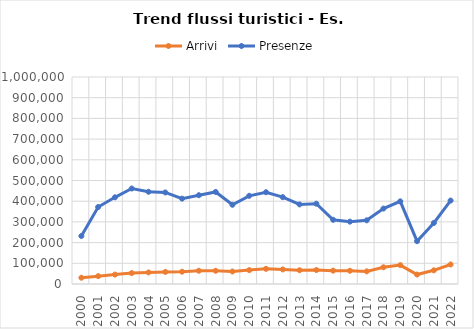
| Category | Arrivi | Presenze |
|---|---|---|
| 2000.0 | 30353 | 231933 |
| 2001.0 | 37988 | 372037 |
| 2002.0 | 45549 | 418808 |
| 2003.0 | 52703 | 461262 |
| 2004.0 | 55936 | 445572 |
| 2005.0 | 58427 | 442263 |
| 2006.0 | 59378 | 412339 |
| 2007.0 | 63933 | 428958 |
| 2008.0 | 63916 | 444651 |
| 2009.0 | 60431 | 382659 |
| 2010.0 | 67059 | 426071 |
| 2011.0 | 73326 | 443370 |
| 2012.0 | 70404 | 419553 |
| 2013.0 | 66521 | 384469 |
| 2014.0 | 67481 | 387987 |
| 2015.0 | 64525 | 310088 |
| 2016.0 | 64035 | 301230 |
| 2017.0 | 60983 | 307605 |
| 2018.0 | 80877 | 364507 |
| 2019.0 | 91230 | 399314 |
| 2020.0 | 45639 | 206902 |
| 2021.0 | 66092 | 294856 |
| 2022.0 | 94275 | 403063 |